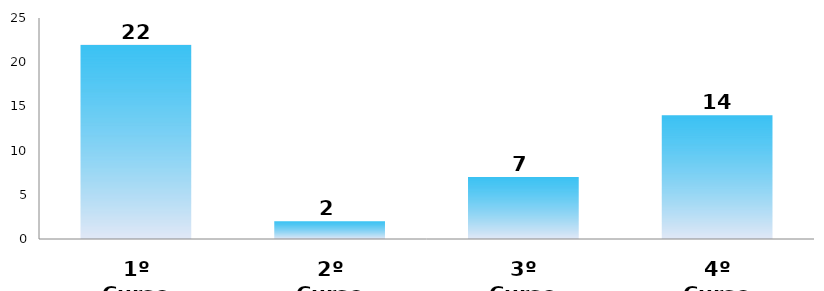
| Category | Series 0 |
|---|---|
| 1º Curso | 22 |
| 2º Curso | 2 |
| 3º Curso | 7 |
| 4º Curso | 14 |